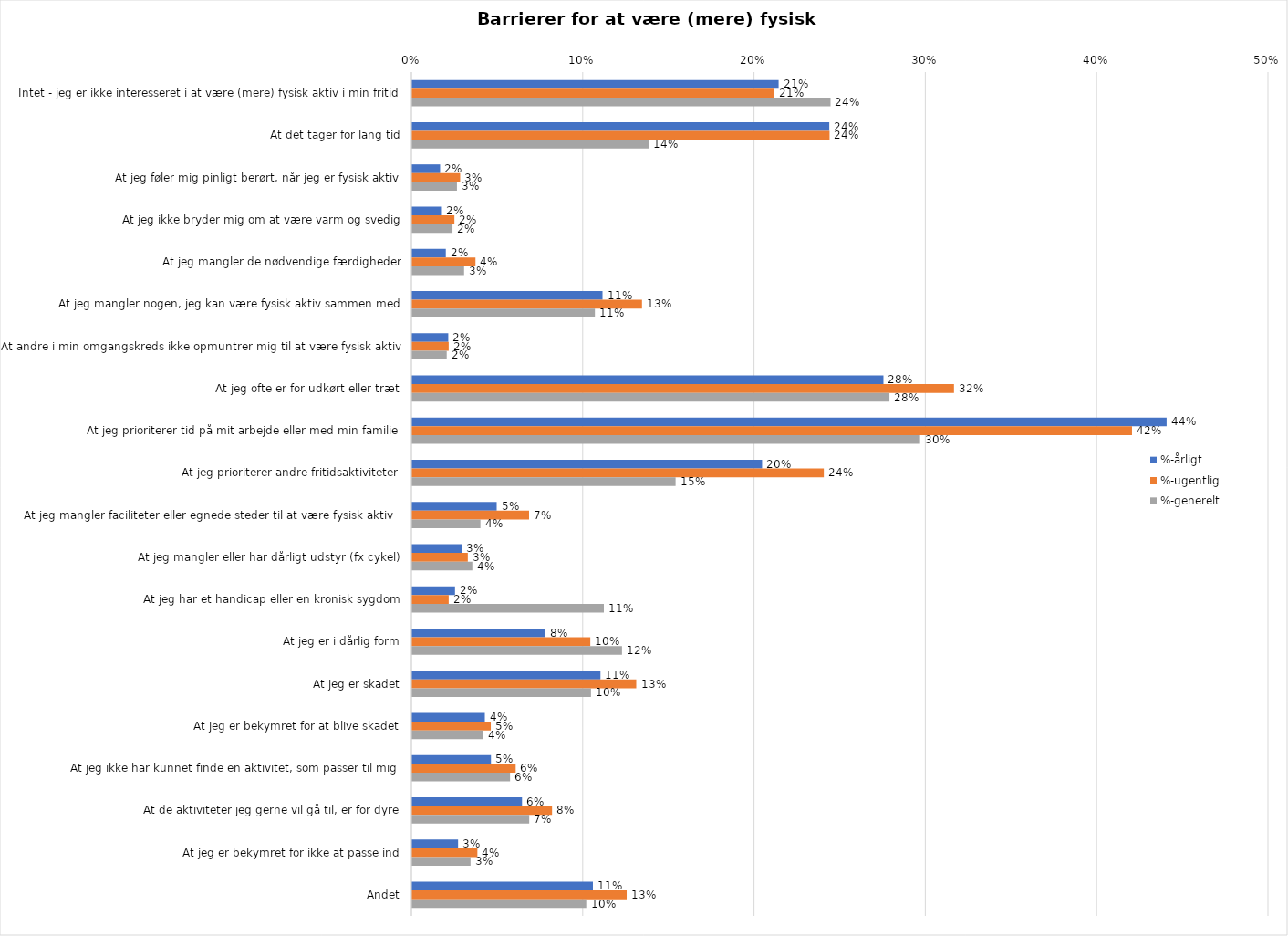
| Category | %-årligt | %-ugentlig | %-generelt |
|---|---|---|---|
| Intet - jeg er ikke interesseret i at være (mere) fysisk aktiv i min fritid | 0.214 | 0.211 | 0.244 |
| At det tager for lang tid | 0.243 | 0.244 | 0.138 |
| At jeg føler mig pinligt berørt, når jeg er fysisk aktiv | 0.016 | 0.028 | 0.026 |
| At jeg ikke bryder mig om at være varm og svedig | 0.017 | 0.025 | 0.023 |
| At jeg mangler de nødvendige færdigheder | 0.02 | 0.037 | 0.03 |
| At jeg mangler nogen, jeg kan være fysisk aktiv sammen med | 0.111 | 0.134 | 0.107 |
| At andre i min omgangskreds ikke opmuntrer mig til at være fysisk aktiv | 0.021 | 0.021 | 0.02 |
| At jeg ofte er for udkørt eller træt | 0.275 | 0.316 | 0.279 |
| At jeg prioriterer tid på mit arbejde eller med min familie | 0.44 | 0.42 | 0.296 |
| At jeg prioriterer andre fritidsaktiviteter | 0.204 | 0.24 | 0.154 |
| At jeg mangler faciliteter eller egnede steder til at være fysisk aktiv  | 0.049 | 0.068 | 0.04 |
| At jeg mangler eller har dårligt udstyr (fx cykel) | 0.029 | 0.032 | 0.035 |
| At jeg har et handicap eller en kronisk sygdom | 0.025 | 0.021 | 0.112 |
| At jeg er i dårlig form | 0.078 | 0.104 | 0.122 |
| At jeg er skadet | 0.11 | 0.131 | 0.104 |
| At jeg er bekymret for at blive skadet | 0.042 | 0.046 | 0.041 |
| At jeg ikke har kunnet finde en aktivitet, som passer til mig  | 0.046 | 0.06 | 0.057 |
| At de aktiviteter jeg gerne vil gå til, er for dyre | 0.064 | 0.082 | 0.068 |
| At jeg er bekymret for ikke at passe ind | 0.027 | 0.038 | 0.034 |
| Andet | 0.105 | 0.125 | 0.102 |